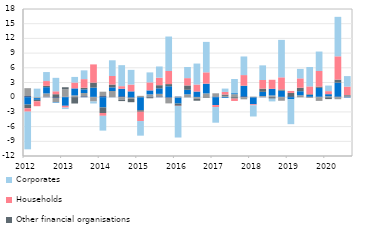
| Category | Non-profit and other organisations | Local authorities  | Currency in circulation | Other financial organisations | Households | Corporates |
|---|---|---|---|---|---|---|
| 2012 | 0.202 | 1.641 | -1.502 | -0.756 | -0.691 | -7.686 |
| II | 0.002 | -0.188 | -0.341 | -0.312 | -0.998 | 1.747 |
| III | 0.11 | 0.664 | 1.273 | 0.274 | 0.972 | 1.84 |
| IV | -0.138 | -0.873 | -0.098 | 0.61 | 0.594 | 2.749 |
| 2013 | 0.079 | 1.527 | -1.754 | 0.426 | -0.373 | -0.296 |
| II | 0.059 | 0.305 | 1.437 | -1.286 | 1.19 | 1.148 |
| III | 0.165 | 0.682 | 0.754 | 0.325 | 1.76 | 1.79 |
| IV | 0.076 | -0.87 | 1.873 | 1.027 | 3.718 | -0.415 |
| 2014 | 0.199 | 0.924 | -2.085 | -1.142 | -0.569 | -3.023 |
| II | 0.035 | 1.231 | 0.74 | 0.578 | 1.742 | 3.202 |
| III | 0.178 | -0.545 | 1.556 | -0.251 | 0.516 | 4.284 |
| IV | -0.104 | -0.237 | 1.19 | -0.68 | 1.391 | 3 |
| 2015 | -0.031 | 0.277 | -2.623 | -0.313 | -1.902 | -2.981 |
| II | 0.129 | 0.455 | 0.809 | -0.218 | 1.631 | 2.039 |
| III | 0.145 | 0.535 | 1.129 | 0.641 | 1.533 | 2.287 |
| IV | -0.109 | -1.155 | 2.237 | 0.437 | 2.676 | 7.032 |
| 2016 | 0.104 | -0.104 | -1.193 | -0.452 | -0.054 | -6.424 |
| II | -0.033 | 0.597 | 0.912 | 0.894 | 1.489 | 2.276 |
| III | 0.058 | -0.277 | 1.097 | -0.443 | 1.429 | 4.281 |
| IV | -0.001 | 0.781 | 1.984 | -0.118 | 2.31 | 6.213 |
| 2017 | 0.133 | 0.64 | -1.599 | 0.025 | -0.411 | -3.193 |
| II | 0.059 | 0.207 | -0.138 | 0.273 | 0.541 | 0.678 |
| III | 0.02 | 0.6 | 0.199 | -0.281 | -0.487 | 2.895 |
| IV | 0.183 | -0.435 | 2.116 | 0.066 | 2.148 | 3.798 |
| 2018 | -0.069 | 0.088 | -1.382 | 0.022 | -0.202 | -2.284 |
| II | 0.083 | 0.156 | 0.854 | 0.654 | 1.762 | 2.986 |
| III | 0.089 | 0.272 | 1.347 | -0.301 | 1.848 | -0.557 |
| IV | 0.082 | -0.727 | 1.258 | 0.234 | 2.481 | 7.641 |
| 2019 | 0.187 | 0.021 | -0.439 | 0.661 | 0.411 | -5.065 |
| II | -0.015 | 0.395 | 0.82 | 0.717 | 1.911 | 1.934 |
| III | 0.109 | -0.155 | 0.363 | 0.139 | 1.592 | 3.965 |
| IV | 0.106 | -0.756 | 1.801 | 0.269 | 3.171 | 3.974 |
| 2020 | -0.044 | 0.196 | 0.422 | -0.345 | 0.62 | 1.138 |
| II | 0.14 | -0.412 | 2.831 | 0.621 | 4.751 | 8.057 |
| III | 0.136 | 0.188 | -0.059 | 0.127 | 1.713 | 2.143 |